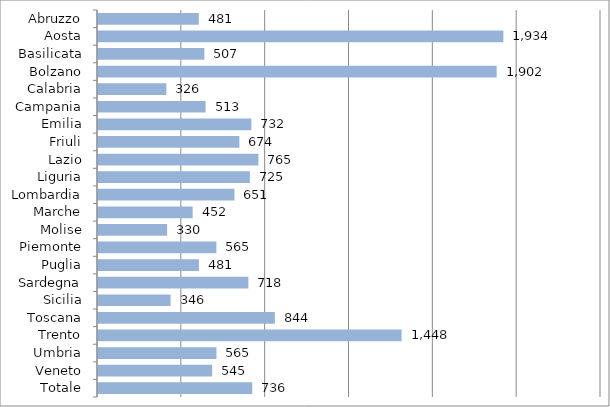
| Category | Series 0 |
|---|---|
| Abruzzo | 480.949 |
| Aosta | 1934.261 |
| Basilicata | 507.497 |
| Bolzano | 1902.294 |
| Calabria | 326.178 |
| Campania | 513.207 |
| Emilia | 731.802 |
| Friuli | 674.426 |
| Lazio | 765.452 |
| Liguria | 724.6 |
| Lombardia | 651.15 |
| Marche | 451.667 |
| Molise | 329.702 |
| Piemonte | 564.814 |
| Puglia | 481.425 |
| Sardegna | 717.631 |
| Sicilia | 346.133 |
| Toscana | 843.889 |
| Trento | 1448.352 |
| Umbria | 565.196 |
| Veneto | 544.804 |
| Totale | 735.986 |